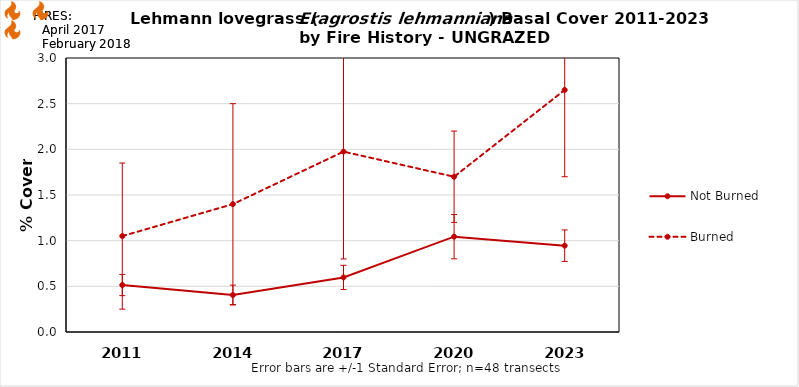
| Category | Not Burned | Burned |
|---|---|---|
| 2011.0 | 0.514 | 1.05 |
| 2014.0 | 0.405 | 1.4 |
| 2017.0 | 0.598 | 1.975 |
| 2020.0 | 1.044 | 1.7 |
| 2023.0 | 0.945 | 2.65 |